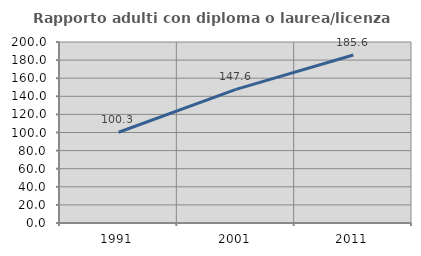
| Category | Rapporto adulti con diploma o laurea/licenza media  |
|---|---|
| 1991.0 | 100.266 |
| 2001.0 | 147.607 |
| 2011.0 | 185.641 |